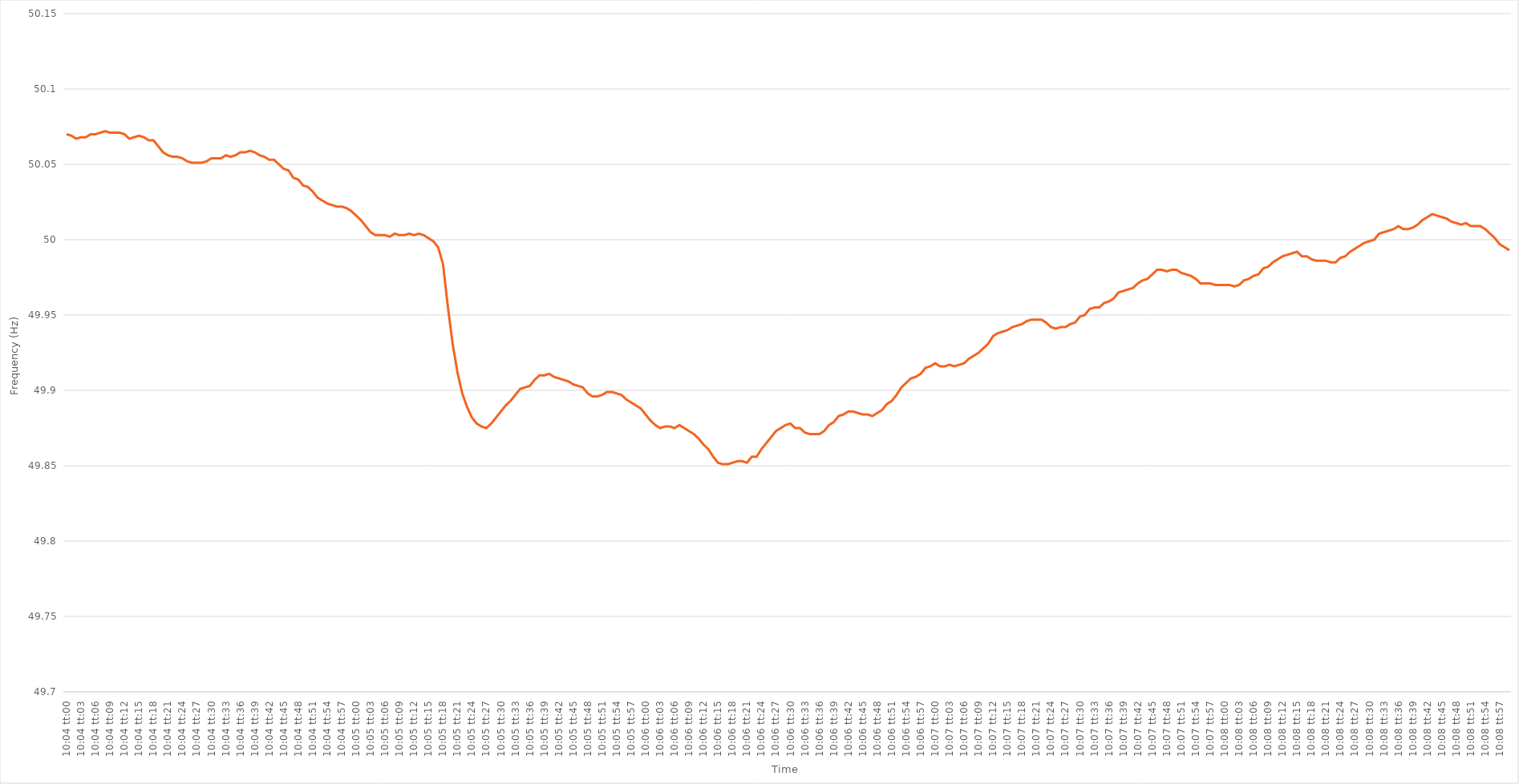
| Category | Series 0 |
|---|---|
| 0.41944444444444445 | 50.07 |
| 0.41945601851851855 | 50.069 |
| 0.4194675925925926 | 50.067 |
| 0.4194791666666667 | 50.068 |
| 0.4194907407407407 | 50.068 |
| 0.41950231481481487 | 50.07 |
| 0.4195138888888889 | 50.07 |
| 0.41952546296296295 | 50.071 |
| 0.41953703703703704 | 50.072 |
| 0.4195486111111111 | 50.071 |
| 0.4195601851851852 | 50.071 |
| 0.4195717592592592 | 50.071 |
| 0.41958333333333336 | 50.07 |
| 0.4195949074074074 | 50.067 |
| 0.4196064814814815 | 50.068 |
| 0.41961805555555554 | 50.069 |
| 0.41962962962962963 | 50.068 |
| 0.41964120370370367 | 50.066 |
| 0.4196527777777778 | 50.066 |
| 0.41966435185185186 | 50.062 |
| 0.41967592592592595 | 50.058 |
| 0.4196875 | 50.056 |
| 0.4196990740740741 | 50.055 |
| 0.4197106481481481 | 50.055 |
| 0.4197222222222223 | 50.054 |
| 0.4197337962962963 | 50.052 |
| 0.41974537037037035 | 50.051 |
| 0.41975694444444445 | 50.051 |
| 0.4197685185185185 | 50.051 |
| 0.4197800925925926 | 50.052 |
| 0.4197916666666666 | 50.054 |
| 0.41980324074074077 | 50.054 |
| 0.4198148148148148 | 50.054 |
| 0.4198263888888889 | 50.056 |
| 0.41983796296296294 | 50.055 |
| 0.41984953703703703 | 50.056 |
| 0.4198611111111111 | 50.058 |
| 0.4198726851851852 | 50.058 |
| 0.41988425925925926 | 50.059 |
| 0.41989583333333336 | 50.058 |
| 0.4199074074074074 | 50.056 |
| 0.4199189814814815 | 50.055 |
| 0.41993055555555553 | 50.053 |
| 0.4199421296296297 | 50.053 |
| 0.4199537037037037 | 50.05 |
| 0.4199652777777778 | 50.047 |
| 0.41997685185185185 | 50.046 |
| 0.4199884259259259 | 50.041 |
| 0.42 | 50.04 |
| 0.420011574074074 | 50.036 |
| 0.4200231481481482 | 50.035 |
| 0.4200347222222222 | 50.032 |
| 0.4200462962962963 | 50.028 |
| 0.42005787037037035 | 50.026 |
| 0.42006944444444444 | 50.024 |
| 0.4200810185185185 | 50.023 |
| 0.42009259259259263 | 50.022 |
| 0.42010416666666667 | 50.022 |
| 0.42011574074074076 | 50.021 |
| 0.4201273148148148 | 50.019 |
| 0.4201388888888889 | 50.016 |
| 0.42015046296296293 | 50.013 |
| 0.4201620370370371 | 50.009 |
| 0.4201736111111111 | 50.005 |
| 0.4201851851851852 | 50.003 |
| 0.42019675925925926 | 50.003 |
| 0.42020833333333335 | 50.003 |
| 0.4202199074074074 | 50.002 |
| 0.42023148148148143 | 50.004 |
| 0.4202430555555556 | 50.003 |
| 0.4202546296296296 | 50.003 |
| 0.4202662037037037 | 50.004 |
| 0.42027777777777775 | 50.003 |
| 0.42028935185185184 | 50.004 |
| 0.4203009259259259 | 50.003 |
| 0.42031250000000003 | 50.001 |
| 0.42032407407407407 | 49.999 |
| 0.42033564814814817 | 49.995 |
| 0.4203472222222222 | 49.984 |
| 0.4203587962962963 | 49.956 |
| 0.42037037037037034 | 49.931 |
| 0.4203819444444445 | 49.912 |
| 0.4203935185185185 | 49.898 |
| 0.4204050925925926 | 49.889 |
| 0.42041666666666666 | 49.882 |
| 0.42042824074074076 | 49.878 |
| 0.4204398148148148 | 49.876 |
| 0.42045138888888894 | 49.875 |
| 0.420462962962963 | 49.878 |
| 0.420474537037037 | 49.882 |
| 0.4204861111111111 | 49.886 |
| 0.42049768518518515 | 49.89 |
| 0.42050925925925925 | 49.893 |
| 0.4205208333333333 | 49.897 |
| 0.42053240740740744 | 49.901 |
| 0.4205439814814815 | 49.902 |
| 0.42055555555555557 | 49.903 |
| 0.4205671296296296 | 49.907 |
| 0.4205787037037037 | 49.91 |
| 0.42059027777777774 | 49.91 |
| 0.4206018518518519 | 49.911 |
| 0.42061342592592593 | 49.909 |
| 0.420625 | 49.908 |
| 0.42063657407407407 | 49.907 |
| 0.42064814814814816 | 49.906 |
| 0.4206597222222222 | 49.904 |
| 0.42067129629629635 | 49.903 |
| 0.4206828703703704 | 49.902 |
| 0.4206944444444444 | 49.898 |
| 0.4207060185185185 | 49.896 |
| 0.42071759259259256 | 49.896 |
| 0.42072916666666665 | 49.897 |
| 0.4207407407407407 | 49.899 |
| 0.42075231481481484 | 49.899 |
| 0.4207638888888889 | 49.898 |
| 0.420775462962963 | 49.897 |
| 0.420787037037037 | 49.894 |
| 0.4207986111111111 | 49.892 |
| 0.42081018518518515 | 49.89 |
| 0.4208217592592593 | 49.888 |
| 0.42083333333333334 | 49.884 |
| 0.42084490740740743 | 49.88 |
| 0.42085648148148147 | 49.877 |
| 0.42086805555555556 | 49.875 |
| 0.4208796296296296 | 49.876 |
| 0.42089120370370375 | 49.876 |
| 0.4209027777777778 | 49.875 |
| 0.4209143518518519 | 49.877 |
| 0.4209259259259259 | 49.875 |
| 0.42093749999999996 | 49.873 |
| 0.42094907407407406 | 49.871 |
| 0.4209606481481481 | 49.868 |
| 0.42097222222222225 | 49.864 |
| 0.4209837962962963 | 49.861 |
| 0.4209953703703704 | 49.856 |
| 0.4210069444444444 | 49.852 |
| 0.4210185185185185 | 49.851 |
| 0.42103009259259255 | 49.851 |
| 0.4210416666666667 | 49.852 |
| 0.42105324074074074 | 49.853 |
| 0.42106481481481484 | 49.853 |
| 0.4210763888888889 | 49.852 |
| 0.42108796296296297 | 49.856 |
| 0.421099537037037 | 49.856 |
| 0.42111111111111116 | 49.861 |
| 0.4211226851851852 | 49.865 |
| 0.4211342592592593 | 49.869 |
| 0.42114583333333333 | 49.873 |
| 0.4211574074074074 | 49.875 |
| 0.42116898148148146 | 49.877 |
| 0.4211805555555555 | 49.878 |
| 0.42119212962962965 | 49.875 |
| 0.4212037037037037 | 49.875 |
| 0.4212152777777778 | 49.872 |
| 0.4212268518518518 | 49.871 |
| 0.4212384259259259 | 49.871 |
| 0.42124999999999996 | 49.871 |
| 0.4212615740740741 | 49.873 |
| 0.42127314814814815 | 49.877 |
| 0.42128472222222224 | 49.879 |
| 0.4212962962962963 | 49.883 |
| 0.4213078703703704 | 49.884 |
| 0.4213194444444444 | 49.886 |
| 0.42133101851851856 | 49.886 |
| 0.4213425925925926 | 49.885 |
| 0.4213541666666667 | 49.884 |
| 0.42136574074074074 | 49.884 |
| 0.42137731481481483 | 49.883 |
| 0.42138888888888887 | 49.885 |
| 0.421400462962963 | 49.887 |
| 0.42141203703703706 | 49.891 |
| 0.4214236111111111 | 49.893 |
| 0.4214351851851852 | 49.897 |
| 0.42144675925925923 | 49.902 |
| 0.4214583333333333 | 49.905 |
| 0.42146990740740736 | 49.908 |
| 0.4214814814814815 | 49.909 |
| 0.42149305555555555 | 49.911 |
| 0.42150462962962965 | 49.915 |
| 0.4215162037037037 | 49.916 |
| 0.4215277777777778 | 49.918 |
| 0.4215393518518518 | 49.916 |
| 0.42155092592592597 | 49.916 |
| 0.4215625 | 49.917 |
| 0.4215740740740741 | 49.916 |
| 0.42158564814814814 | 49.917 |
| 0.42159722222222223 | 49.918 |
| 0.4216087962962963 | 49.921 |
| 0.4216203703703704 | 49.923 |
| 0.42163194444444446 | 49.925 |
| 0.4216435185185185 | 49.928 |
| 0.4216550925925926 | 49.931 |
| 0.42166666666666663 | 49.936 |
| 0.42167824074074073 | 49.938 |
| 0.42168981481481477 | 49.939 |
| 0.4217013888888889 | 49.94 |
| 0.42171296296296296 | 49.942 |
| 0.42172453703703705 | 49.943 |
| 0.4217361111111111 | 49.944 |
| 0.4217476851851852 | 49.946 |
| 0.4217592592592592 | 49.947 |
| 0.4217708333333334 | 49.947 |
| 0.4217824074074074 | 49.947 |
| 0.4217939814814815 | 49.945 |
| 0.42180555555555554 | 49.942 |
| 0.42181712962962964 | 49.941 |
| 0.4218287037037037 | 49.942 |
| 0.42184027777777783 | 49.942 |
| 0.42185185185185187 | 49.944 |
| 0.42186342592592596 | 49.945 |
| 0.421875 | 49.949 |
| 0.42188657407407404 | 49.95 |
| 0.42189814814814813 | 49.954 |
| 0.42190972222222217 | 49.955 |
| 0.4219212962962963 | 49.955 |
| 0.42193287037037036 | 49.958 |
| 0.42194444444444446 | 49.959 |
| 0.4219560185185185 | 49.961 |
| 0.4219675925925926 | 49.965 |
| 0.4219791666666666 | 49.966 |
| 0.4219907407407408 | 49.967 |
| 0.4220023148148148 | 49.968 |
| 0.4220138888888889 | 49.971 |
| 0.42202546296296295 | 49.973 |
| 0.42203703703703704 | 49.974 |
| 0.4220486111111111 | 49.977 |
| 0.42206018518518523 | 49.98 |
| 0.42207175925925927 | 49.98 |
| 0.42208333333333337 | 49.979 |
| 0.4220949074074074 | 49.98 |
| 0.4221064814814815 | 49.98 |
| 0.42211805555555554 | 49.978 |
| 0.4221296296296296 | 49.977 |
| 0.4221412037037037 | 49.976 |
| 0.42215277777777777 | 49.974 |
| 0.42216435185185186 | 49.971 |
| 0.4221759259259259 | 49.971 |
| 0.4221875 | 49.971 |
| 0.42219907407407403 | 49.97 |
| 0.4222106481481482 | 49.97 |
| 0.4222222222222222 | 49.97 |
| 0.4222337962962963 | 49.97 |
| 0.42224537037037035 | 49.969 |
| 0.42225694444444445 | 49.97 |
| 0.4222685185185185 | 49.973 |
| 0.42228009259259264 | 49.974 |
| 0.4222916666666667 | 49.976 |
| 0.42230324074074077 | 49.977 |
| 0.4223148148148148 | 49.981 |
| 0.4223263888888889 | 49.982 |
| 0.42233796296296294 | 49.985 |
| 0.422349537037037 | 49.987 |
| 0.42236111111111113 | 49.989 |
| 0.42237268518518517 | 49.99 |
| 0.42238425925925926 | 49.991 |
| 0.4223958333333333 | 49.992 |
| 0.4224074074074074 | 49.989 |
| 0.42241898148148144 | 49.989 |
| 0.4224305555555556 | 49.987 |
| 0.4224421296296296 | 49.986 |
| 0.4224537037037037 | 49.986 |
| 0.42246527777777776 | 49.986 |
| 0.42247685185185185 | 49.985 |
| 0.4224884259259259 | 49.985 |
| 0.42250000000000004 | 49.988 |
| 0.4225115740740741 | 49.989 |
| 0.4225231481481482 | 49.992 |
| 0.4225347222222222 | 49.994 |
| 0.4225462962962963 | 49.996 |
| 0.42255787037037035 | 49.998 |
| 0.4225694444444445 | 49.999 |
| 0.42258101851851854 | 50 |
| 0.4225925925925926 | 50.004 |
| 0.42260416666666667 | 50.005 |
| 0.4226157407407407 | 50.006 |
| 0.4226273148148148 | 50.007 |
| 0.42263888888888884 | 50.009 |
| 0.422650462962963 | 50.007 |
| 0.42266203703703703 | 50.007 |
| 0.4226736111111111 | 50.008 |
| 0.42268518518518516 | 50.01 |
| 0.42269675925925926 | 50.013 |
| 0.4227083333333333 | 50.015 |
| 0.42271990740740745 | 50.017 |
| 0.4227314814814815 | 50.016 |
| 0.4227430555555556 | 50.015 |
| 0.4227546296296296 | 50.014 |
| 0.4227662037037037 | 50.012 |
| 0.42277777777777775 | 50.011 |
| 0.4227893518518519 | 50.01 |
| 0.42280092592592594 | 50.011 |
| 0.42281250000000004 | 50.009 |
| 0.4228240740740741 | 50.009 |
| 0.4228356481481481 | 50.009 |
| 0.4228472222222222 | 50.007 |
| 0.42285879629629625 | 50.004 |
| 0.4228703703703704 | 50.001 |
| 0.42288194444444444 | 49.997 |
| 0.42289351851851853 | 49.995 |
| 0.42290509259259257 | 49.993 |